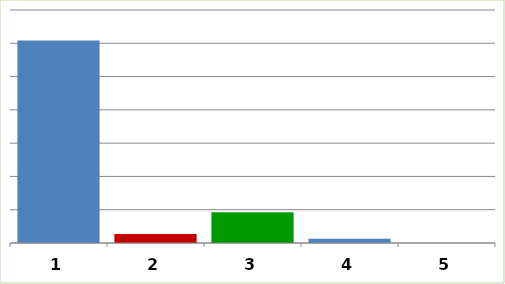
| Category | Series 0 |
|---|---|
| 0 | 304204648.99 |
| 1 | 13418127.4 |
| 2 | 46282857 |
| 3 | 6252499.85 |
| 4 | 0 |